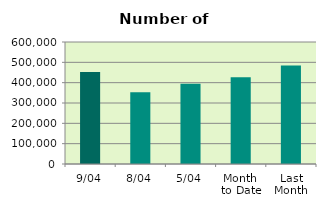
| Category | Series 0 |
|---|---|
| 9/04 | 452228 |
| 8/04 | 352860 |
| 5/04 | 395058 |
| Month 
to Date | 426872.286 |
| Last
Month | 483948.286 |